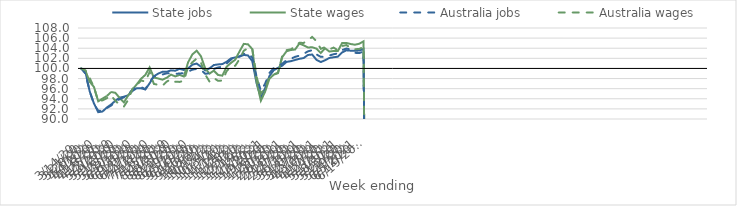
| Category | State jobs | State wages | Australia jobs | Australia wages |
|---|---|---|---|---|
| 14/03/2020 | 100 | 100 | 100 | 100 |
| 21/03/2020 | 99.322 | 99.572 | 98.971 | 99.604 |
| 28/03/2020 | 95.463 | 97.366 | 95.467 | 98.106 |
| 04/04/2020 | 93.06 | 96.33 | 92.922 | 96.239 |
| 11/04/2020 | 91.352 | 93.495 | 91.648 | 93.488 |
| 18/04/2020 | 91.484 | 94.044 | 91.632 | 93.693 |
| 25/04/2020 | 92.266 | 94.54 | 92.163 | 94.114 |
| 02/05/2020 | 92.859 | 95.344 | 92.661 | 94.661 |
| 09/05/2020 | 93.616 | 95.181 | 93.345 | 93.586 |
| 16/05/2020 | 94.228 | 94.162 | 93.938 | 92.82 |
| 23/05/2020 | 94.412 | 93.285 | 94.296 | 92.472 |
| 30/05/2020 | 94.692 | 94.682 | 94.804 | 93.802 |
| 06/06/2020 | 95.547 | 95.831 | 95.79 | 95.983 |
| 13/06/2020 | 96.1 | 96.863 | 96.291 | 96.659 |
| 20/06/2020 | 96.083 | 97.958 | 96.307 | 97.626 |
| 27/06/2020 | 95.841 | 98.718 | 95.924 | 97.398 |
| 04/07/2020 | 97.052 | 100.203 | 97.286 | 99.305 |
| 11/07/2020 | 98.441 | 98.198 | 98.453 | 96.936 |
| 18/07/2020 | 98.972 | 98.018 | 98.574 | 96.771 |
| 25/07/2020 | 99.336 | 97.773 | 98.8 | 96.557 |
| 01/08/2020 | 99.329 | 98.162 | 99.036 | 97.398 |
| 08/08/2020 | 99.624 | 98.776 | 99.039 | 97.865 |
| 15/08/2020 | 99.55 | 98.42 | 98.915 | 97.373 |
| 22/08/2020 | 99.921 | 98.724 | 99.01 | 97.336 |
| 29/08/2020 | 99.697 | 98.407 | 99.05 | 97.544 |
| 05/09/2020 | 100.02 | 101.217 | 99.381 | 100.291 |
| 12/09/2020 | 100.755 | 102.781 | 99.754 | 101.228 |
| 19/09/2020 | 100.966 | 103.51 | 99.918 | 101.971 |
| 26/09/2020 | 100.352 | 102.415 | 99.725 | 101.154 |
| 03/10/2020 | 99.617 | 99.996 | 98.937 | 98.795 |
| 10/10/2020 | 100.001 | 98.976 | 99.064 | 97.403 |
| 17/10/2020 | 100.67 | 99.568 | 99.896 | 98.12 |
| 24/10/2020 | 100.798 | 98.711 | 100.185 | 97.546 |
| 31/10/2020 | 100.865 | 98.571 | 100.363 | 97.615 |
| 07/11/2020 | 101.316 | 100.336 | 100.966 | 99.446 |
| 14/11/2020 | 101.987 | 101.084 | 101.741 | 100.424 |
| 21/11/2020 | 102.17 | 101.715 | 102.085 | 100.522 |
| 28/11/2020 | 102.339 | 103.347 | 102.383 | 101.813 |
| 05/12/2020 | 102.678 | 104.856 | 102.872 | 103.509 |
| 12/12/2020 | 102.568 | 104.77 | 102.957 | 104.014 |
| 19/12/2020 | 101.447 | 103.826 | 102.168 | 103.915 |
| 26/12/2020 | 97.08 | 97.367 | 98.391 | 98.452 |
| 02/01/2021 | 94.24 | 93.616 | 95.58 | 95.006 |
| 09/01/2021 | 96.108 | 95.417 | 96.988 | 96.148 |
| 16/01/2021 | 98.493 | 97.953 | 99.101 | 98.251 |
| 23/01/2021 | 99.652 | 98.763 | 100.068 | 98.817 |
| 30/01/2021 | 100.108 | 99.066 | 100.556 | 99.148 |
| 06/02/2021 | 100.56 | 102.243 | 100.923 | 102.467 |
| 13/02/2021 | 101.296 | 103.395 | 101.643 | 103.619 |
| 20/02/2021 | 101.436 | 103.644 | 101.902 | 103.78 |
| 27/02/2021 | 101.675 | 103.74 | 102.3 | 104.333 |
| 06/03/2021 | 101.904 | 104.929 | 102.521 | 105.064 |
| 13/03/2021 | 102.056 | 104.568 | 102.877 | 105.052 |
| 20/03/2021 | 102.665 | 104.142 | 103.384 | 105.539 |
| 27/03/2021 | 102.753 | 104.197 | 103.612 | 106.245 |
| 03/04/2021 | 101.704 | 103.919 | 102.769 | 105.395 |
| 10/04/2021 | 101.263 | 103.049 | 102.293 | 103.884 |
| 17/04/2021 | 101.618 | 103.996 | 102.308 | 104.211 |
| 24/04/2021 | 102.069 | 103.348 | 102.558 | 103.772 |
| 01/05/2021 | 102.216 | 103.45 | 102.806 | 104.122 |
| 08/05/2021 | 102.329 | 103.437 | 102.974 | 103.594 |
| 15/05/2021 | 103.173 | 105.045 | 103.642 | 104.439 |
| 22/05/2021 | 103.582 | 105.048 | 103.934 | 104.625 |
| 29/05/2021 | 103.511 | 104.828 | 103.744 | 104.038 |
| 05/06/2021 | 103.511 | 104.692 | 103.091 | 103.805 |
| 12/06/2021 | 103.53 | 104.889 | 103.033 | 103.851 |
| 19/06/2021 | 103.869 | 105.368 | 103.366 | 104.254 |